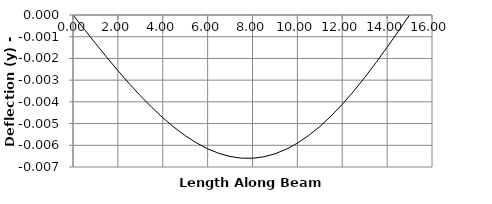
| Category | y |
|---|---|
| 0.0 | 0 |
| 1e-05 | 0 |
| 0.5 | -0.001 |
| 1.0 | -0.001 |
| 1.5 | -0.002 |
| 2.0 | -0.003 |
| 2.00001 | -0.003 |
| 2.5 | -0.003 |
| 3.0 | -0.004 |
| 3.5 | -0.004 |
| 4.0 | -0.005 |
| 4.5 | -0.005 |
| 5.0 | -0.006 |
| 5.5 | -0.006 |
| 6.0 | -0.006 |
| 6.5 | -0.006 |
| 7.0 | -0.007 |
| 7.5 | -0.007 |
| 8.0 | -0.007 |
| 8.5 | -0.007 |
| 9.0 | -0.006 |
| 9.5 | -0.006 |
| 10.0 | -0.006 |
| 10.5 | -0.006 |
| 11.0 | -0.005 |
| 11.5 | -0.005 |
| 12.0 | -0.004 |
| 12.5 | -0.004 |
| 13.0 | -0.003 |
| 13.5 | -0.002 |
| 14.0 | -0.001 |
| 14.5 | -0.001 |
| 15.0 | 0 |